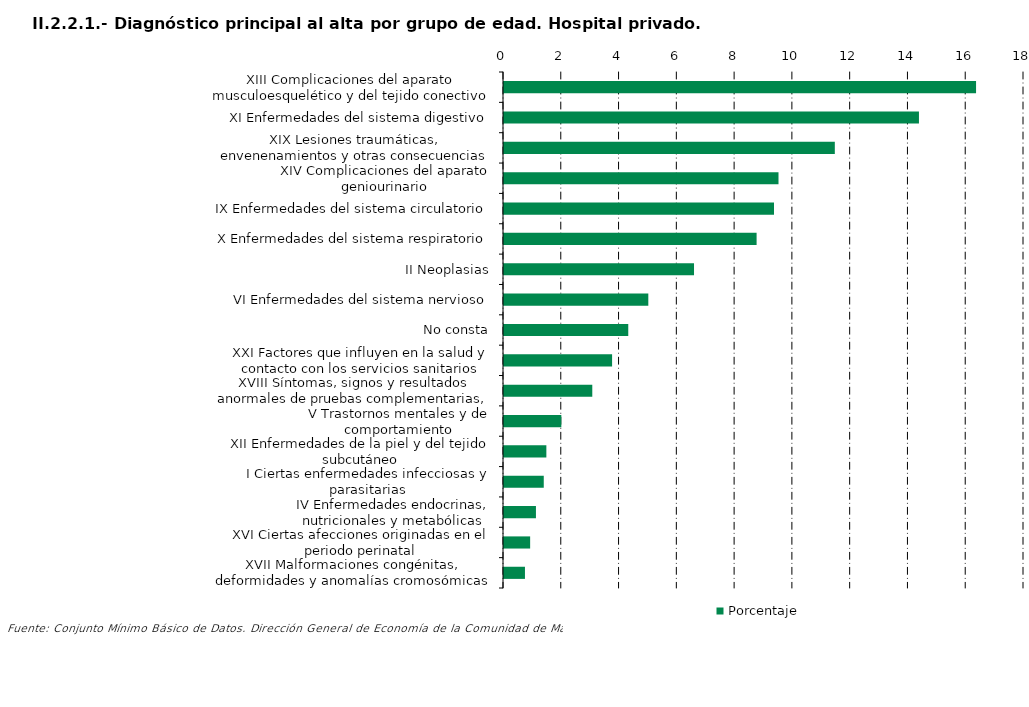
| Category | Porcentaje |
|---|---|
| XIII Complicaciones del aparato musculoesquelético y del tejido conectivo | 16.34 |
| XI Enfermedades del sistema digestivo | 14.364 |
| XIX Lesiones traumáticas, envenenamientos y otras consecuencias de causas externas | 11.451 |
| XIV Complicaciones del aparato geniourinario | 9.502 |
| IX Enfermedades del sistema circulatorio | 9.346 |
| X Enfermedades del sistema respiratorio | 8.744 |
| II Neoplasias | 6.578 |
| VI Enfermedades del sistema nervioso | 4.995 |
| No consta | 4.301 |
| XXI Factores que influyen en la salud y contacto con los servicios sanitarios | 3.742 |
| XVIII Síntomas, signos y resultados anormales de pruebas complementarias, no clasificados bajo otro concepto | 3.056 |
| V Trastornos mentales y de comportamiento | 1.984 |
| XII Enfermedades de la piel y del tejido subcutáneo | 1.466 |
| I Ciertas enfermedades infecciosas y parasitarias | 1.376 |
| IV Enfermedades endocrinas, nutricionales y metabólicas | 1.106 |
| XVI Ciertas afecciones originadas en el periodo perinatal | 0.905 |
| XVII Malformaciones congénitas, deformidades y anomalías cromosómicas | 0.726 |